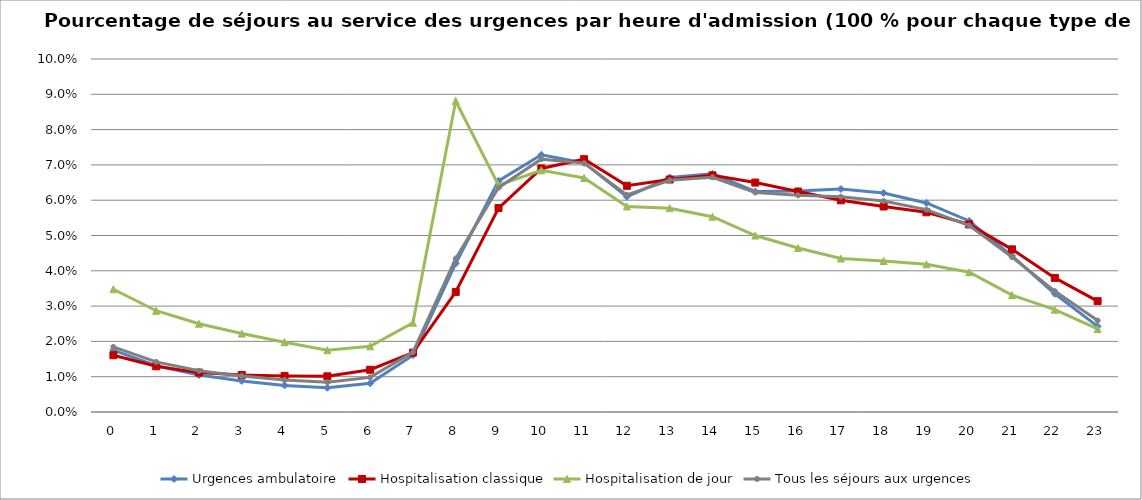
| Category | Urgences ambulatoire | Hospitalisation classique | Hospitalisation de jour | Tous les séjours aux urgences |
|---|---|---|---|---|
| 0.0 | 0.018 | 0.016 | 0.035 | 0.018 |
| 1.0 | 0.013 | 0.013 | 0.029 | 0.014 |
| 2.0 | 0.01 | 0.011 | 0.025 | 0.012 |
| 3.0 | 0.009 | 0.01 | 0.022 | 0.01 |
| 4.0 | 0.008 | 0.01 | 0.02 | 0.009 |
| 5.0 | 0.007 | 0.01 | 0.018 | 0.008 |
| 6.0 | 0.008 | 0.012 | 0.019 | 0.01 |
| 7.0 | 0.016 | 0.017 | 0.025 | 0.017 |
| 8.0 | 0.042 | 0.034 | 0.088 | 0.043 |
| 9.0 | 0.065 | 0.058 | 0.064 | 0.064 |
| 10.0 | 0.073 | 0.069 | 0.068 | 0.072 |
| 11.0 | 0.071 | 0.072 | 0.066 | 0.071 |
| 12.0 | 0.061 | 0.064 | 0.058 | 0.062 |
| 13.0 | 0.066 | 0.066 | 0.058 | 0.066 |
| 14.0 | 0.067 | 0.067 | 0.055 | 0.066 |
| 15.0 | 0.062 | 0.065 | 0.05 | 0.062 |
| 16.0 | 0.063 | 0.062 | 0.046 | 0.061 |
| 17.0 | 0.063 | 0.06 | 0.043 | 0.061 |
| 18.0 | 0.062 | 0.058 | 0.043 | 0.06 |
| 19.0 | 0.059 | 0.057 | 0.042 | 0.057 |
| 20.0 | 0.054 | 0.053 | 0.04 | 0.053 |
| 21.0 | 0.044 | 0.046 | 0.033 | 0.044 |
| 22.0 | 0.034 | 0.038 | 0.029 | 0.034 |
| 23.0 | 0.024 | 0.031 | 0.024 | 0.026 |